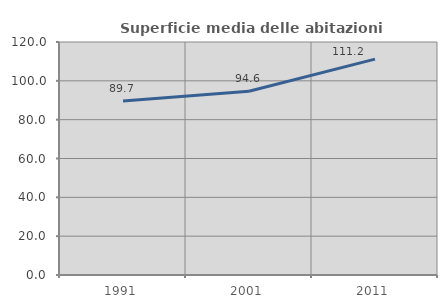
| Category | Superficie media delle abitazioni occupate |
|---|---|
| 1991.0 | 89.651 |
| 2001.0 | 94.615 |
| 2011.0 | 111.193 |